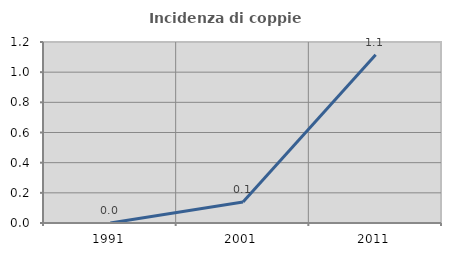
| Category | Incidenza di coppie miste |
|---|---|
| 1991.0 | 0 |
| 2001.0 | 0.139 |
| 2011.0 | 1.115 |